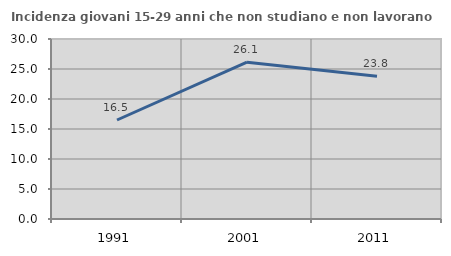
| Category | Incidenza giovani 15-29 anni che non studiano e non lavorano  |
|---|---|
| 1991.0 | 16.5 |
| 2001.0 | 26.126 |
| 2011.0 | 23.81 |